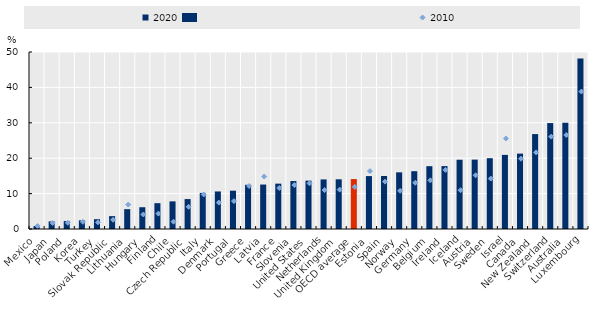
| Category | 2020 |
|---|---|
| Mexico | 0.852 |
| Japan | 2.153 |
| Poland | 2.244 |
| Korea | 2.437 |
| Turkey | 2.767 |
| Slovak Republic | 3.634 |
| Lithuania | 5.605 |
| Hungary | 6.152 |
| Finland | 7.295 |
| Chile | 7.808 |
| Czech Republic | 8.451 |
| Italy | 10.191 |
| Denmark | 10.607 |
| Portugal | 10.824 |
| Greece | 12.484 |
| Latvia | 12.563 |
| France | 12.811 |
| Slovenia | 13.546 |
| United States | 13.655 |
| Netherlands | 14.005 |
| United Kingdom | 14.041 |
| OECD average | 14.108 |
| Estonia | 14.949 |
| Spain | 14.965 |
| Norway | 16.007 |
| Germany | 16.33 |
| Belgium | 17.744 |
| Ireland | 17.772 |
| Iceland | 19.566 |
| Austria | 19.601 |
| Sweden | 19.999 |
| Israel | 20.937 |
| Canada | 21.298 |
| New Zealand | 26.813 |
| Switzerland | 29.927 |
| Australia | 30.016 |
| Luxembourg | 48.195 |